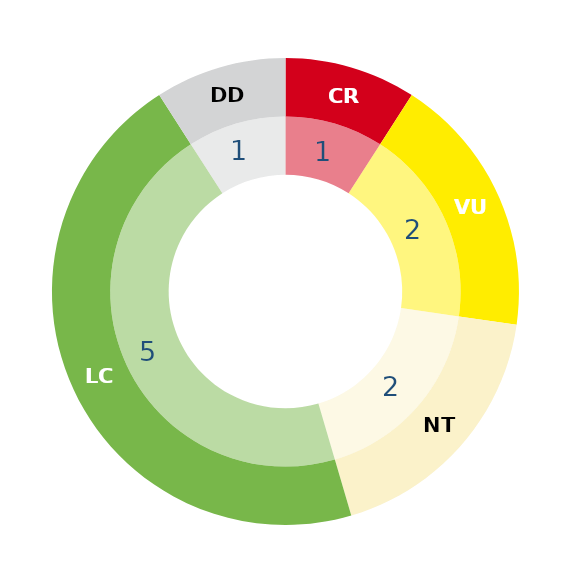
| Category | Series 1 | Series 0 |
|---|---|---|
| RE | 0 | 0 |
| CR | 1 | 1 |
| EN | 0 | 0 |
| VU | 2 | 2 |
| NT | 2 | 2 |
| LC | 5 | 5 |
| DD | 1 | 1 |